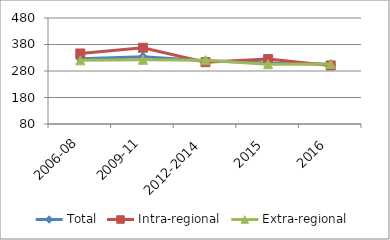
| Category | Total | Intra-regional | Extra-regional |
|---|---|---|---|
| 2006-08 | 326.62 | 346.097 | 320.268 |
| 2009-11 | 333.46 | 367.706 | 322.293 |
| 2012-2014 | 319.023 | 313.176 | 320.93 |
| 2015 | 310.494 | 325.021 | 305.757 |
| 2016 | 305.371 | 301.028 | 306.787 |